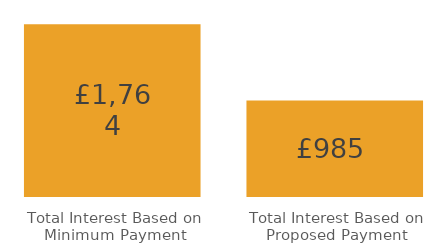
| Category | Series 0 |
|---|---|
| Total Interest Based on Minimum Payment | 1763.952 |
| Total Interest Based on Proposed Payment | 984.811 |